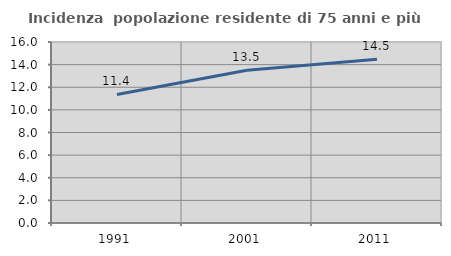
| Category | Incidenza  popolazione residente di 75 anni e più |
|---|---|
| 1991.0 | 11.367 |
| 2001.0 | 13.505 |
| 2011.0 | 14.483 |